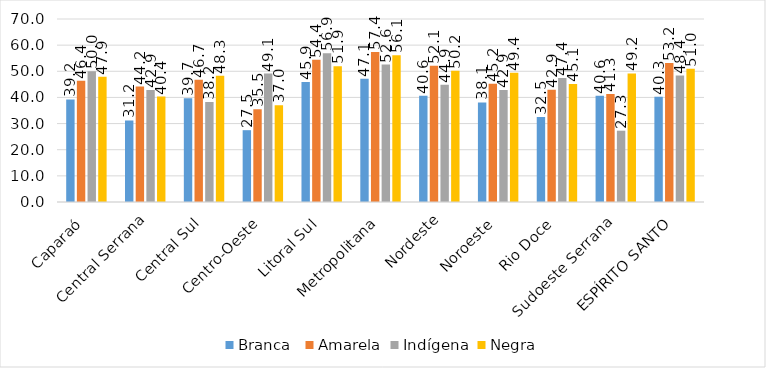
| Category | Branca  | Amarela | Indígena | Negra |
|---|---|---|---|---|
| Caparaó | 39.227 | 46.383 | 50 | 47.886 |
| Central Serrana | 31.178 | 44.156 | 42.857 | 40.354 |
| Central Sul | 39.695 | 46.739 | 38.235 | 48.304 |
| Centro-Oeste | 27.47 | 35.496 | 49.123 | 37.013 |
| Litoral Sul | 45.905 | 54.377 | 56.863 | 51.931 |
| Metropolitana | 47.117 | 57.388 | 52.569 | 56.109 |
| Nordeste | 40.633 | 52.077 | 44.853 | 50.192 |
| Noroeste | 38.068 | 45.238 | 42.857 | 49.424 |
| Rio Doce | 32.541 | 42.922 | 47.448 | 45.107 |
| Sudoeste Serrana | 40.624 | 41.333 | 27.273 | 49.158 |
| ESPÍRITO SANTO | 40.272 | 53.195 | 48.364 | 51.006 |